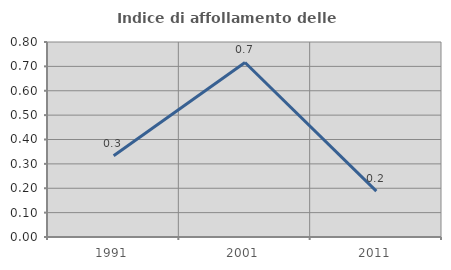
| Category | Indice di affollamento delle abitazioni  |
|---|---|
| 1991.0 | 0.333 |
| 2001.0 | 0.716 |
| 2011.0 | 0.188 |